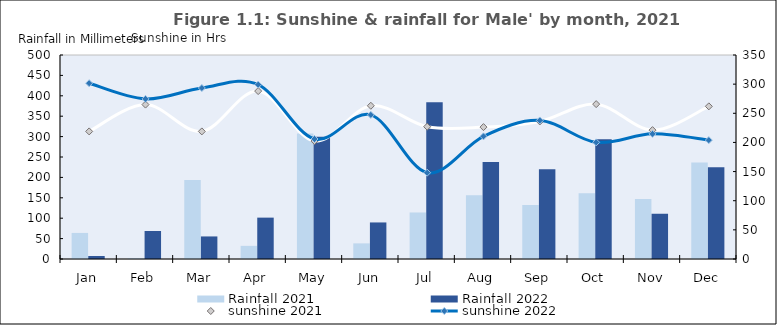
| Category | Rainfall |
|---|---|
| Jan | 7.3 |
| Feb | 68.7 |
| Mar | 55.3 |
| Apr | 101.4 |
| May | 299.9 |
| Jun | 89.6 |
| Jul | 384.2 |
| Aug | 237.6 |
| Sep | 219.8 |
| Oct | 293.7 |
| Nov | 110.9 |
| Dec | 224.8 |